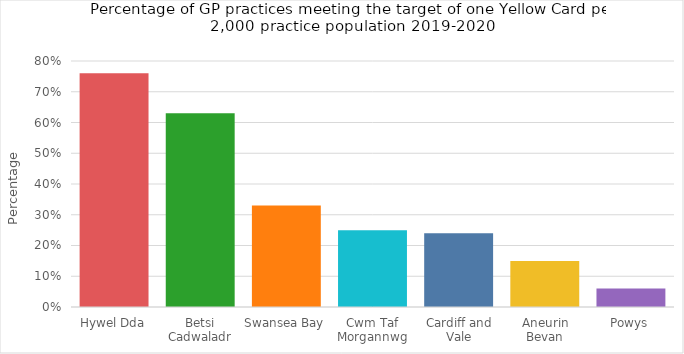
| Category | Series 0 |
|---|---|
| Hywel Dda | 0.76 |
| Betsi Cadwaladr | 0.63 |
| Swansea Bay | 0.33 |
| Cwm Taf Morgannwg | 0.25 |
| Cardiff and Vale | 0.24 |
| Aneurin Bevan | 0.15 |
| Powys | 0.06 |